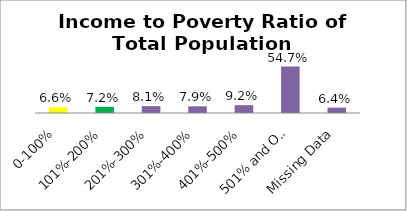
| Category | Percent |
|---|---|
| 0-100% | 0.066 |
| 101%-200% | 0.072 |
| 201%-300% | 0.081 |
| 301%-400% | 0.079 |
| 401%-500% | 0.092 |
| 501% and Over | 0.547 |
| Missing Data | 0.064 |